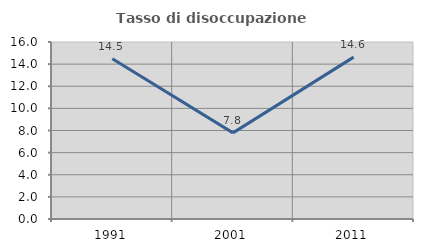
| Category | Tasso di disoccupazione giovanile  |
|---|---|
| 1991.0 | 14.489 |
| 2001.0 | 7.787 |
| 2011.0 | 14.634 |